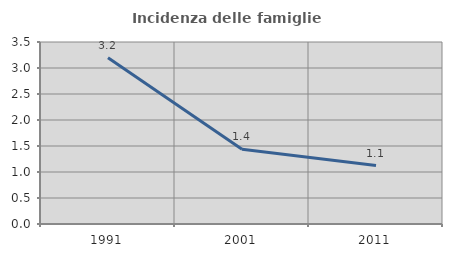
| Category | Incidenza delle famiglie numerose |
|---|---|
| 1991.0 | 3.196 |
| 2001.0 | 1.436 |
| 2011.0 | 1.123 |